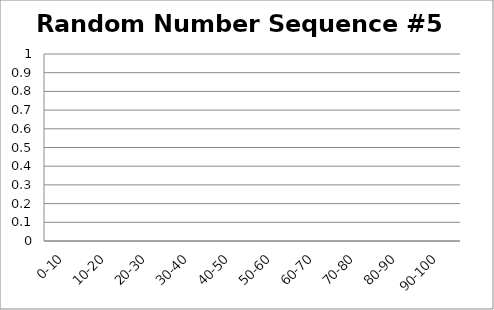
| Category | Random Number Sequence #5 |
|---|---|
| 0-10 | 0 |
| 10-20 | 0 |
| 20-30 | 0 |
| 30-40 | 0 |
| 40-50 | 0 |
| 50-60 | 0 |
| 60-70 | 0 |
| 70-80 | 0 |
| 80-90 | 0 |
| 90-100 | 0 |